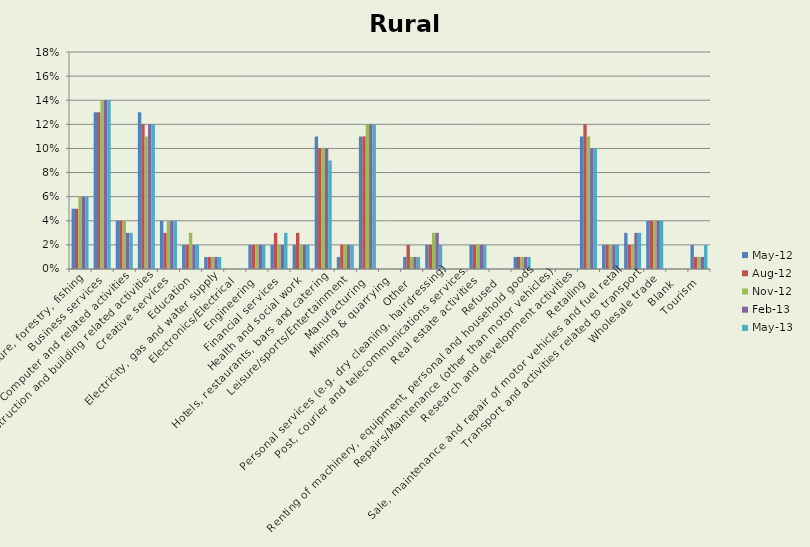
| Category | May-12 | Aug-12 | Nov-12 | Feb-13 | May-13 |
|---|---|---|---|---|---|
| Agriculture, forestry, fishing | 0.05 | 0.05 | 0.06 | 0.06 | 0.06 |
| Business services | 0.13 | 0.13 | 0.14 | 0.14 | 0.14 |
| Computer and related activities | 0.04 | 0.04 | 0.04 | 0.03 | 0.03 |
| Construction and building related activities | 0.13 | 0.12 | 0.11 | 0.12 | 0.12 |
| Creative services | 0.04 | 0.03 | 0.04 | 0.04 | 0.04 |
| Education | 0.02 | 0.02 | 0.03 | 0.02 | 0.02 |
| Electricity, gas and water supply | 0.01 | 0.01 | 0.01 | 0.01 | 0.01 |
| Electronics/Electrical | 0 | 0 | 0 | 0 | 0 |
| Engineering | 0.02 | 0.02 | 0.02 | 0.02 | 0.02 |
| Financial services | 0.02 | 0.03 | 0.02 | 0.02 | 0.03 |
| Health and social work | 0.02 | 0.03 | 0.02 | 0.02 | 0.02 |
| Hotels, restaurants, bars and catering | 0.11 | 0.1 | 0.1 | 0.1 | 0.09 |
| Leisure/sports/Entertainment | 0.01 | 0.02 | 0.02 | 0.02 | 0.02 |
| Manufacturing | 0.11 | 0.11 | 0.12 | 0.12 | 0.12 |
| Mining & quarrying | 0 | 0 | 0 | 0 | 0 |
| Other | 0.01 | 0.02 | 0.01 | 0.01 | 0.01 |
| Personal services (e.g. dry cleaning, hairdressing) | 0.02 | 0.02 | 0.03 | 0.03 | 0.02 |
| Post, courier and telecommunications services | 0 | 0 | 0 | 0 | 0 |
| Real estate activities | 0.02 | 0.02 | 0.02 | 0.02 | 0.02 |
| Refused | 0 | 0 | 0 | 0 | 0 |
| Renting of machinery, equipment, personal and household goods | 0.01 | 0.01 | 0.01 | 0.01 | 0.01 |
| Repairs/Maintenance (other than motor vehicles) | 0 | 0 | 0 | 0 | 0 |
| Research and development activities | 0 | 0 | 0 | 0 | 0 |
| Retailing | 0.11 | 0.12 | 0.11 | 0.1 | 0.1 |
| Sale, maintenance and repair of motor vehicles and fuel retail | 0.02 | 0.02 | 0.02 | 0.02 | 0.02 |
| Transport and activities related to transport | 0.03 | 0.02 | 0.02 | 0.03 | 0.03 |
| Wholesale trade | 0.04 | 0.04 | 0.04 | 0.04 | 0.04 |
| Blank | 0 | 0 | 0 | 0 | 0 |
| Tourism | 0.02 | 0.01 | 0.01 | 0.01 | 0.02 |